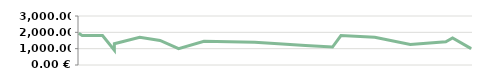
| Category | CHIFFRE D’AFFAIRES |
|---|---|
| 2013-04-23 | 1950 |
| 2013-04-25 | 1800 |
| 2013-05-07 | 1800 |
| 2013-05-14 | 900 |
| 2013-05-14 | 1300 |
| 2013-05-29 | 1700 |
| 2013-06-10 | 1500 |
| 2013-06-21 | 1000 |
| 2013-07-06 | 1450 |
| 2013-08-05 | 1400 |
| 2013-08-19 | 1300 |
| 2013-09-04 | 1200 |
| 2013-09-20 | 1100 |
| 2013-09-25 | 1800 |
| 2013-10-15 | 1700 |
| 2013-11-05 | 1250 |
| 2013-11-26 | 1425 |
| 2013-11-30 | 1650 |
| 2013-12-11 | 1000 |